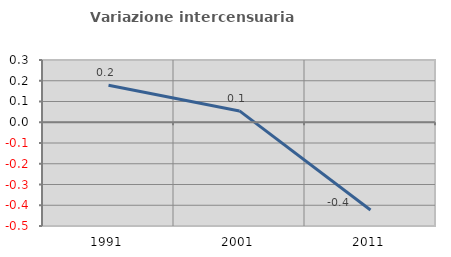
| Category | Variazione intercensuaria annua |
|---|---|
| 1991.0 | 0.178 |
| 2001.0 | 0.055 |
| 2011.0 | -0.423 |